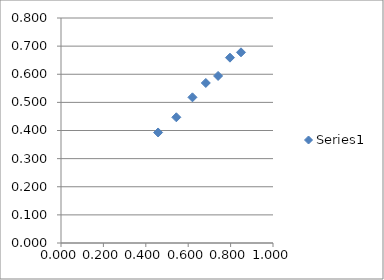
| Category | Series 0 |
|---|---|
| 0.458 | 0.393 |
| 0.544 | 0.447 |
| 0.62 | 0.518 |
| 0.683 | 0.569 |
| 0.741 | 0.594 |
| 0.797 | 0.659 |
| 0.849 | 0.678 |